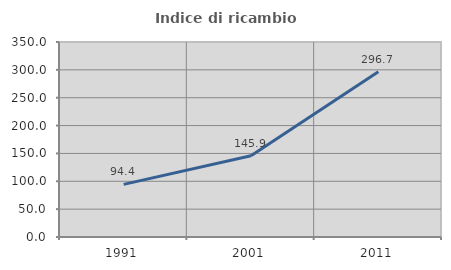
| Category | Indice di ricambio occupazionale  |
|---|---|
| 1991.0 | 94.393 |
| 2001.0 | 145.882 |
| 2011.0 | 296.667 |